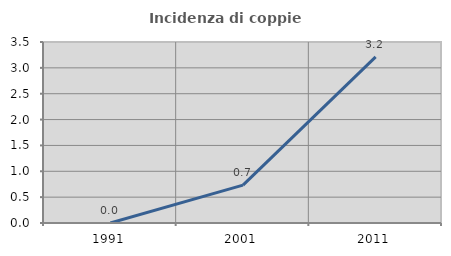
| Category | Incidenza di coppie miste |
|---|---|
| 1991.0 | 0 |
| 2001.0 | 0.733 |
| 2011.0 | 3.211 |